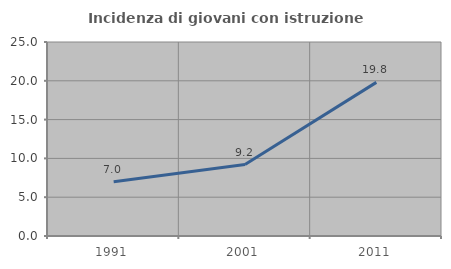
| Category | Incidenza di giovani con istruzione universitaria |
|---|---|
| 1991.0 | 6.997 |
| 2001.0 | 9.208 |
| 2011.0 | 19.794 |